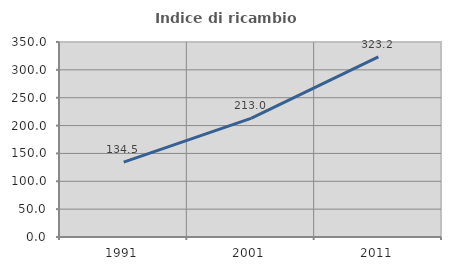
| Category | Indice di ricambio occupazionale  |
|---|---|
| 1991.0 | 134.524 |
| 2001.0 | 212.955 |
| 2011.0 | 323.2 |